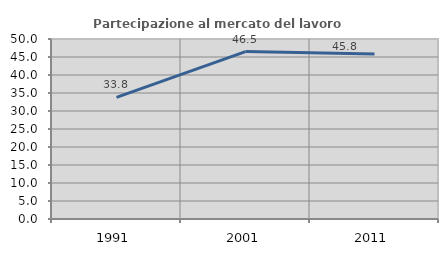
| Category | Partecipazione al mercato del lavoro  femminile |
|---|---|
| 1991.0 | 33.776 |
| 2001.0 | 46.512 |
| 2011.0 | 45.845 |